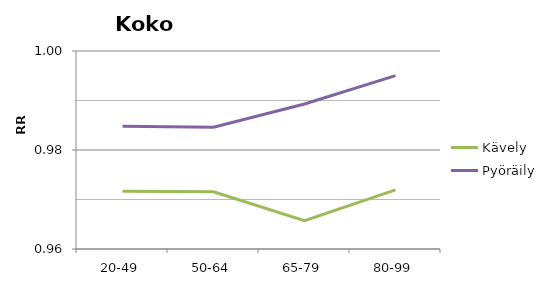
| Category | Kävely | Pyöräily |
|---|---|---|
| 20-49 | 0.972 | 0.985 |
| 50-64 | 0.972 | 0.985 |
| 65-79 | 0.966 | 0.989 |
| 80-99 | 0.972 | 0.995 |